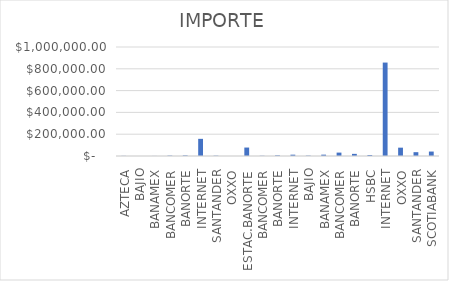
| Category | IMPORTE |
|---|---|
| AZTECA | 1313.29 |
| BAJIO | 78.59 |
| BANAMEX | 584.1 |
| BANCOMER | 3540.88 |
| BANORTE | 5368.49 |
| INTERNET | 157397.27 |
| SANTANDER | 2948.25 |
| OXXO | 113 |
| ESTAC.BANORTE | 77524 |
| BANCOMER | 2071 |
| BANORTE | 5935 |
| INTERNET | 12187 |
| BAJIO | 3531.81 |
| BANAMEX | 12347.93 |
| BANCOMER | 31169.16 |
| BANORTE | 19607.09 |
| HSBC | 8987.64 |
| INTERNET | 857159.78 |
| OXXO | 76474.17 |
| SANTANDER | 35108.02 |
| SCOTIABANK | 40779.12 |